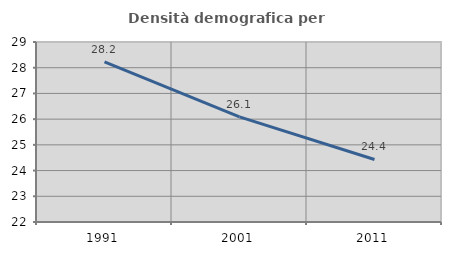
| Category | Densità demografica |
|---|---|
| 1991.0 | 28.225 |
| 2001.0 | 26.089 |
| 2011.0 | 24.431 |